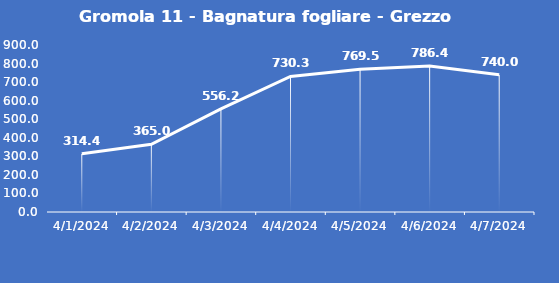
| Category | Gromola 11 - Bagnatura fogliare - Grezzo (min) |
|---|---|
| 4/1/24 | 314.4 |
| 4/2/24 | 365 |
| 4/3/24 | 556.2 |
| 4/4/24 | 730.3 |
| 4/5/24 | 769.5 |
| 4/6/24 | 786.4 |
| 4/7/24 | 740 |